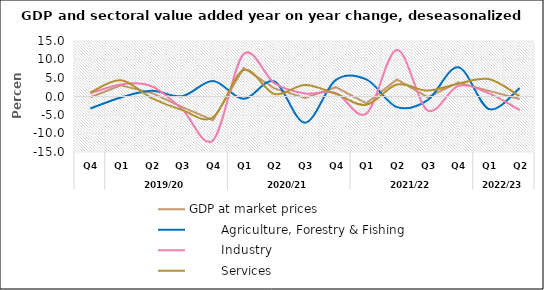
| Category | GDP at market prices |         Agriculture, Forestry & Fishing |         Industry |         Services |
|---|---|---|---|---|
| 0 | -0.201 | -3.251 | 0.827 | 1.124 |
| 1 | 3.037 | -0.27 | 3.265 | 4.366 |
| 2 | 0.972 | 1.545 | 2.764 | -0.432 |
| 3 | -2.872 | 0.091 | -3.538 | -3.683 |
| 4 | -6.4 | 4.185 | -11.864 | -5.624 |
| 5 | 7.717 | -0.624 | 11.472 | 7.15 |
| 6 | 2.186 | 4.042 | 3.59 | 0.699 |
| 7 | -0.373 | -7.07 | 0.801 | 3.101 |
| 8 | 2.516 | 4.439 | 0.974 | 0.729 |
| 9 | -1.863 | 4.618 | -4.628 | -2.246 |
| 10 | 4.592 | -2.878 | 12.549 | 3.255 |
| 11 | -0.146 | -0.963 | -3.754 | 1.594 |
| 12 | 3.755 | 7.907 | 2.871 | 3.446 |
| 13 | 1.523 | -3.385 | 0.844 | 4.71 |
| 14 | -0.656 | 2.265 | -3.674 | 0.05 |